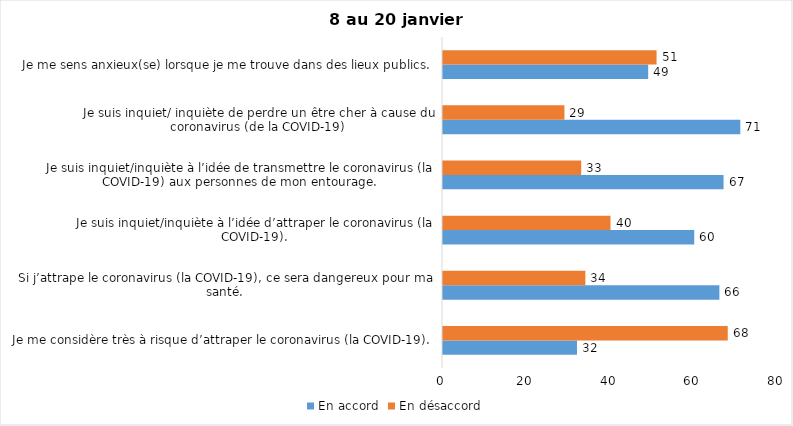
| Category | En accord | En désaccord |
|---|---|---|
| Je me considère très à risque d’attraper le coronavirus (la COVID-19). | 32 | 68 |
| Si j’attrape le coronavirus (la COVID-19), ce sera dangereux pour ma santé. | 66 | 34 |
| Je suis inquiet/inquiète à l’idée d’attraper le coronavirus (la COVID-19). | 60 | 40 |
| Je suis inquiet/inquiète à l’idée de transmettre le coronavirus (la COVID-19) aux personnes de mon entourage. | 67 | 33 |
| Je suis inquiet/ inquiète de perdre un être cher à cause du coronavirus (de la COVID-19) | 71 | 29 |
| Je me sens anxieux(se) lorsque je me trouve dans des lieux publics. | 49 | 51 |